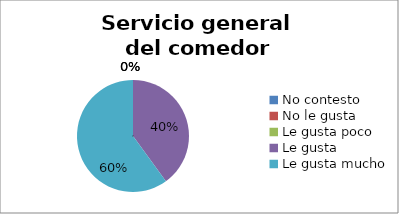
| Category | Series 0 |
|---|---|
| No contesto | 0 |
| No le gusta | 0 |
| Le gusta poco | 0 |
| Le gusta | 2 |
| Le gusta mucho | 3 |